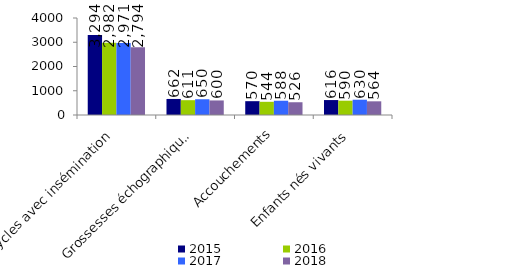
| Category | 2015 | 2016 | 2017 | 2018 |
|---|---|---|---|---|
| Cycles avec insémination | 3294 | 2982 | 2971 | 2794 |
| Grossesses échographiques | 662 | 611 | 650 | 600 |
| Accouchements | 570 | 544 | 588 | 526 |
| Enfants nés vivants | 616 | 590 | 630 | 564 |